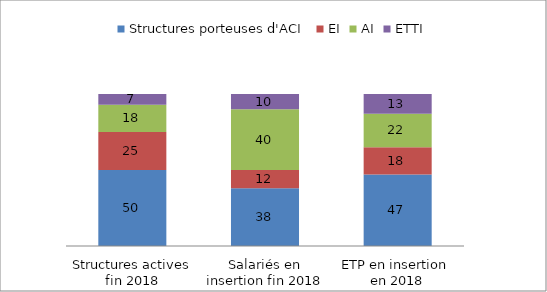
| Category | Structures porteuses d'ACI | EI | AI | ETTI |
|---|---|---|---|---|
| Structures actives fin 2018 | 50 | 25 | 18 | 7 |
| Salariés en insertion fin 2018 | 38 | 12 | 40 | 10 |
| ETP en insertion 
en 2018 | 47 | 18 | 22 | 13 |